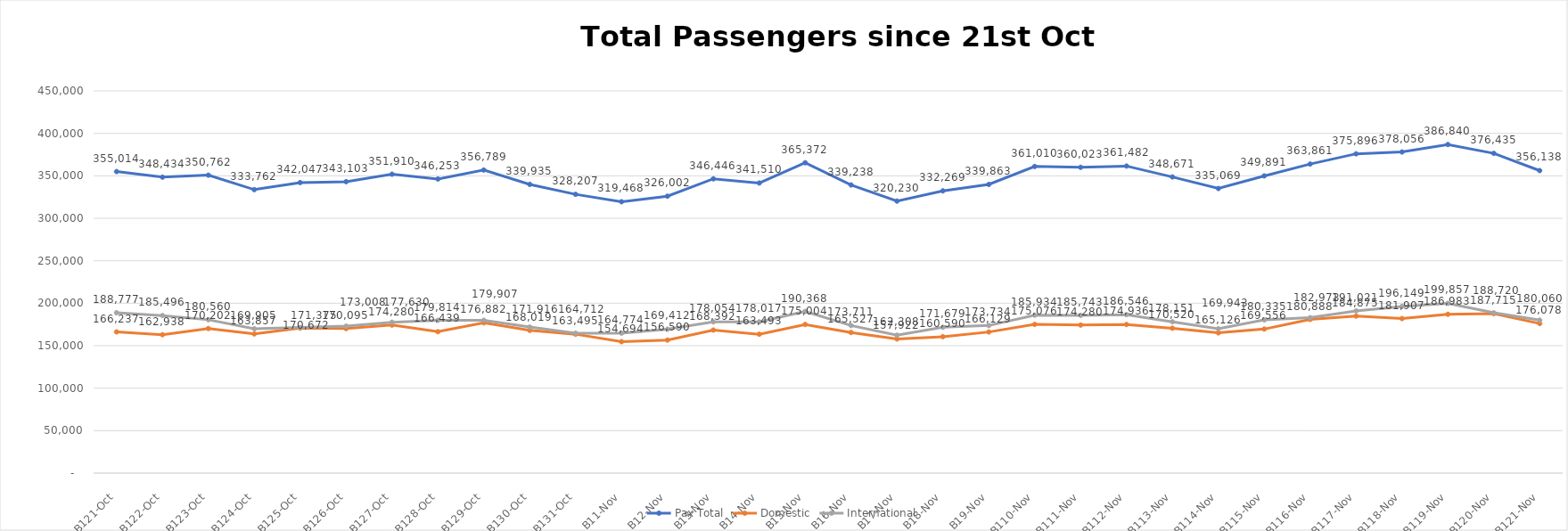
| Category | Pax Total | Domestic | International |
|---|---|---|---|
| 2023-10-21 | 355014 | 166237 | 188777 |
| 2023-10-22 | 348434 | 162938 | 185496 |
| 2023-10-23 | 350762 | 170202 | 180560 |
| 2023-10-24 | 333762 | 163857 | 169905 |
| 2023-10-25 | 342047 | 170672 | 171375 |
| 2023-10-26 | 343103 | 170095 | 173008 |
| 2023-10-27 | 351910 | 174280 | 177630 |
| 2023-10-28 | 346253 | 166439 | 179814 |
| 2023-10-29 | 356789 | 176882 | 179907 |
| 2023-10-30 | 339935 | 168019 | 171916 |
| 2023-10-31 | 328207 | 163495 | 164712 |
| 2023-11-01 | 319468 | 154694 | 164774 |
| 2023-11-02 | 326002 | 156590 | 169412 |
| 2023-11-03 | 346446 | 168392 | 178054 |
| 2023-11-04 | 341510 | 163493 | 178017 |
| 2023-11-05 | 365372 | 175004 | 190368 |
| 2023-11-06 | 339238 | 165527 | 173711 |
| 2023-11-07 | 320230 | 157922 | 162308 |
| 2023-11-08 | 332269 | 160590 | 171679 |
| 2023-11-09 | 339863 | 166129 | 173734 |
| 2023-11-10 | 361010 | 175076 | 185934 |
| 2023-11-11 | 360023 | 174280 | 185743 |
| 2023-11-12 | 361482 | 174936 | 186546 |
| 2023-11-13 | 348671 | 170520 | 178151 |
| 2023-11-14 | 335069 | 165126 | 169943 |
| 2023-11-15 | 349891 | 169556 | 180335 |
| 2023-11-16 | 363861 | 180888 | 182973 |
| 2023-11-17 | 375896 | 184875 | 191021 |
| 2023-11-18 | 378056 | 181907 | 196149 |
| 2023-11-19 | 386840 | 186983 | 199857 |
| 2023-11-20 | 376435 | 187715 | 188720 |
| 2023-11-21 | 356138 | 176078 | 180060 |